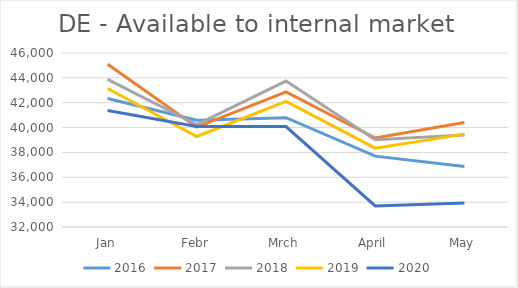
| Category | 2016 | 2017 | 2018 | 2019 | 2020 |
|---|---|---|---|---|---|
| Jan | 42339 | 45095.047 | 43871.612 | 43146.659 | 41377.86 |
| Febr | 40585 | 40037.803 | 40246.963 | 39282.431 | 40094.893 |
| Mrch | 40799 | 42869.924 | 43739.631 | 42101.521 | 40080.317 |
| April | 37701 | 39161.911 | 39023.906 | 38344.904 | 33691.742 |
| May | 36866 | 40413.549 | 39403.393 | 39473.797 | 33940.479 |